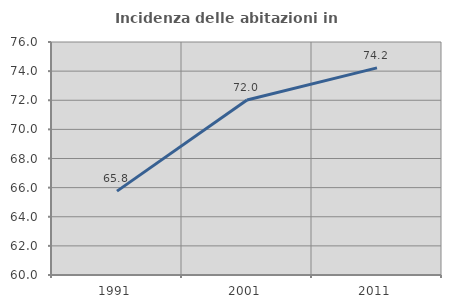
| Category | Incidenza delle abitazioni in proprietà  |
|---|---|
| 1991.0 | 65.761 |
| 2001.0 | 72.021 |
| 2011.0 | 74.223 |